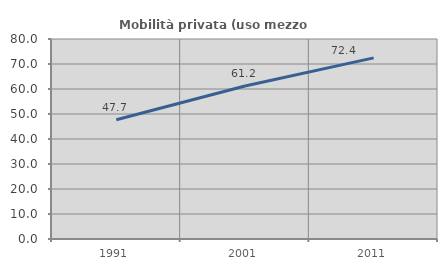
| Category | Mobilità privata (uso mezzo privato) |
|---|---|
| 1991.0 | 47.725 |
| 2001.0 | 61.183 |
| 2011.0 | 72.449 |